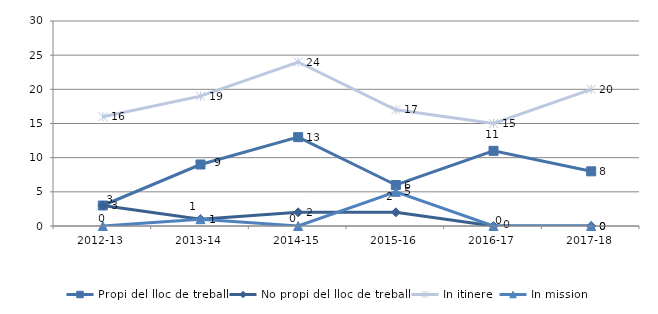
| Category | Propi del lloc de treball | No propi del lloc de treball | In itinere | In mission |
|---|---|---|---|---|
| 2012-13 | 3 | 3 | 16 | 0 |
| 2013-14 | 9 | 1 | 19 | 1 |
| 2014-15 | 13 | 2 | 24 | 0 |
| 2015-16 | 6 | 2 | 17 | 5 |
| 2016-17 | 11 | 0 | 15 | 0 |
| 2017-18 | 8 | 0 | 20 | 0 |